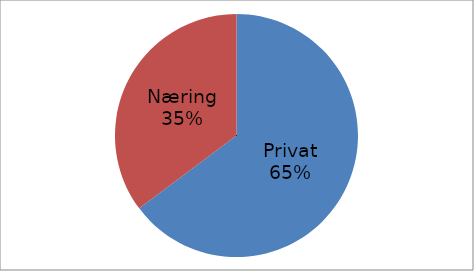
| Category | Series 0 |
|---|---|
| Privat | 38222787 |
| Næring | 20788129 |